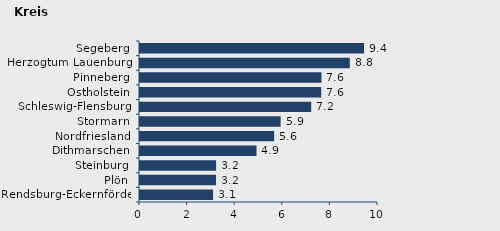
| Category | Wanderungssaldo |
|---|---|
| Rendsburg-Eckernförde | 3.072 |
| Plön | 3.195 |
| Steinburg | 3.198 |
| Dithmarschen | 4.895 |
| Nordfriesland | 5.637 |
| Stormarn | 5.909 |
| Schleswig-Flensburg | 7.194 |
| Ostholstein | 7.613 |
| Pinneberg | 7.624 |
| Herzogtum Lauenburg | 8.816 |
| Segeberg | 9.416 |